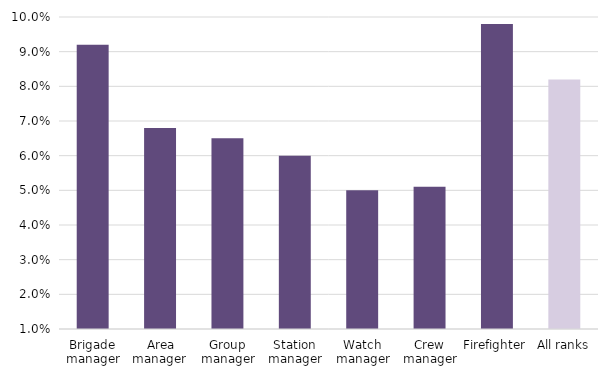
| Category | Series 0 |
|---|---|
| Brigade manager | 0.092 |
| Area manager  | 0.068 |
| Group manager | 0.065 |
| Station manager | 0.06 |
| Watch manager | 0.05 |
| Crew manager | 0.051 |
| Firefighter | 0.098 |
| All ranks | 0.082 |